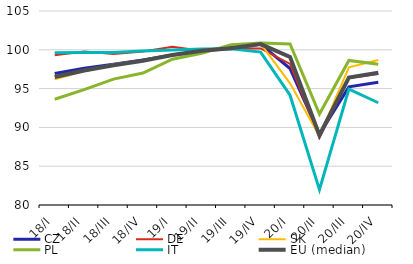
| Category | CZ | DE | SK | PL | IT | EU (median) |
|---|---|---|---|---|---|---|
| 18/I | 96.956 | 99.305 | 96.193 | 93.623 | 99.632 | 96.495 |
| 18/II | 97.625 | 99.773 | 97.237 | 94.874 | 99.662 | 97.326 |
| 18/III | 98.145 | 99.445 | 98.15 | 96.221 | 99.665 | 98.011 |
| 18/IV | 98.699 | 99.782 | 98.62 | 97 | 99.857 | 98.598 |
| 19/I | 99.326 | 100.393 | 99.327 | 98.791 | 99.976 | 99.321 |
| 19/II | 99.857 | 99.888 | 99.728 | 99.55 | 100.116 | 99.871 |
| 19/III | 100.323 | 100.197 | 100.154 | 100.665 | 100.148 | 100.208 |
| 19/IV | 100.708 | 100.178 | 100.791 | 100.867 | 99.711 | 100.739 |
| 20/I | 97.584 | 98.179 | 95.679 | 100.742 | 94.146 | 99.086 |
| 20/II | 89.114 | 88.658 | 88.863 | 91.732 | 81.982 | 88.988 |
| 20/III | 95.225 | 96.372 | 97.752 | 98.623 | 94.929 | 96.434 |
| 20/IV | 95.824 | 96.887 | 98.689 | 98.141 | 93.178 | 97.033 |